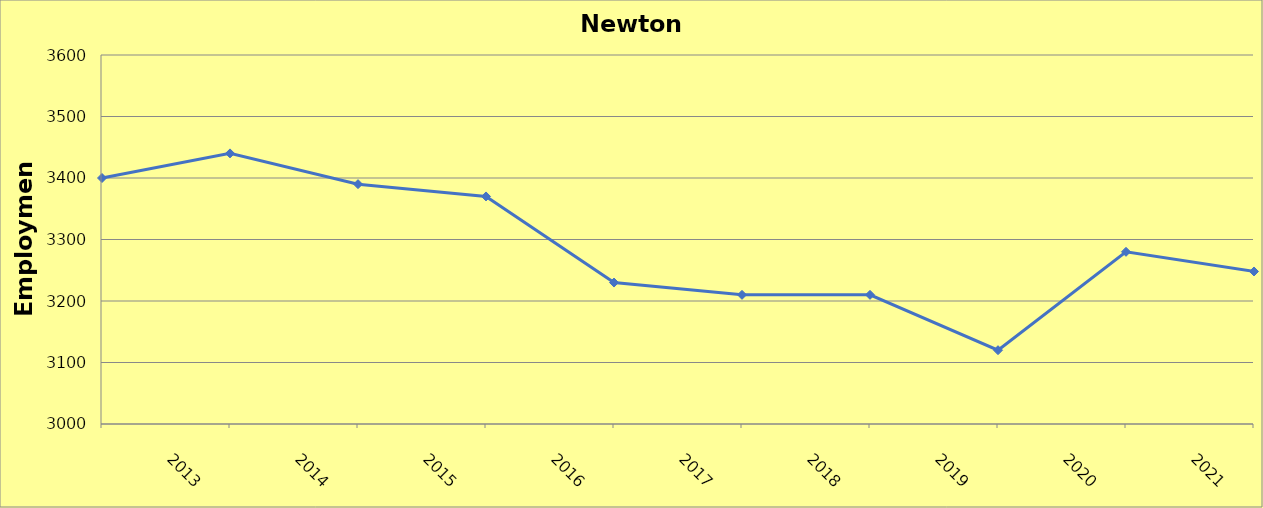
| Category | Newton County |
|---|---|
| 2013.0 | 3400 |
| 2014.0 | 3440 |
| 2015.0 | 3390 |
| 2016.0 | 3370 |
| 2017.0 | 3230 |
| 2018.0 | 3210 |
| 2019.0 | 3210 |
| 2020.0 | 3120 |
| 2021.0 | 3280 |
| 2022.0 | 3248 |